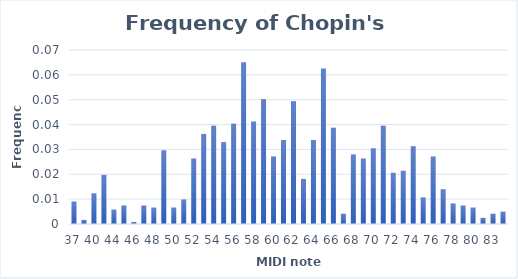
| Category | Series 0 |
|---|---|
| 37.0 | 0.009 |
| 39.0 | 0.002 |
| 40.0 | 0.012 |
| 42.0 | 0.02 |
| 44.0 | 0.006 |
| 45.0 | 0.007 |
| 46.0 | 0.001 |
| 47.0 | 0.007 |
| 48.0 | 0.007 |
| 49.0 | 0.03 |
| 50.0 | 0.007 |
| 51.0 | 0.01 |
| 52.0 | 0.026 |
| 53.0 | 0.036 |
| 54.0 | 0.04 |
| 55.0 | 0.033 |
| 56.0 | 0.04 |
| 57.0 | 0.065 |
| 58.0 | 0.041 |
| 59.0 | 0.05 |
| 60.0 | 0.027 |
| 61.0 | 0.034 |
| 62.0 | 0.049 |
| 63.0 | 0.018 |
| 64.0 | 0.034 |
| 65.0 | 0.063 |
| 66.0 | 0.039 |
| 67.0 | 0.004 |
| 68.0 | 0.028 |
| 69.0 | 0.026 |
| 70.0 | 0.03 |
| 71.0 | 0.04 |
| 72.0 | 0.021 |
| 73.0 | 0.021 |
| 74.0 | 0.031 |
| 75.0 | 0.011 |
| 76.0 | 0.027 |
| 77.0 | 0.014 |
| 78.0 | 0.008 |
| 79.0 | 0.007 |
| 80.0 | 0.007 |
| 81.0 | 0.002 |
| 83.0 | 0.004 |
| 84.0 | 0.005 |